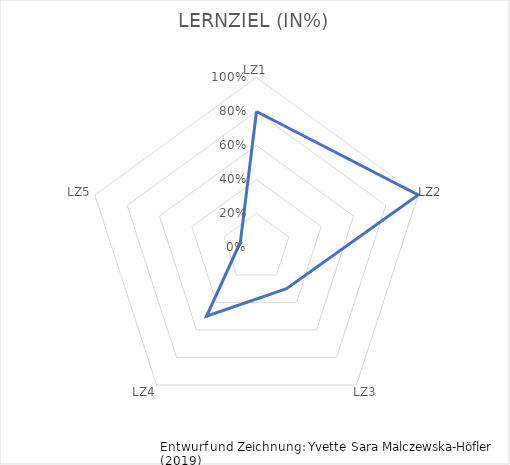
| Category | Prozent erreicht |
|---|---|
| LZ1 | 0.8 |
| LZ2 | 1 |
| LZ3 | 0.3 |
| LZ4 | 0.5 |
| LZ5 | 0.1 |